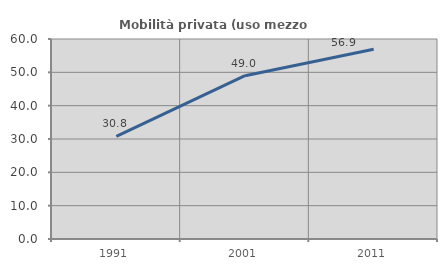
| Category | Mobilità privata (uso mezzo privato) |
|---|---|
| 1991.0 | 30.759 |
| 2001.0 | 48.994 |
| 2011.0 | 56.928 |